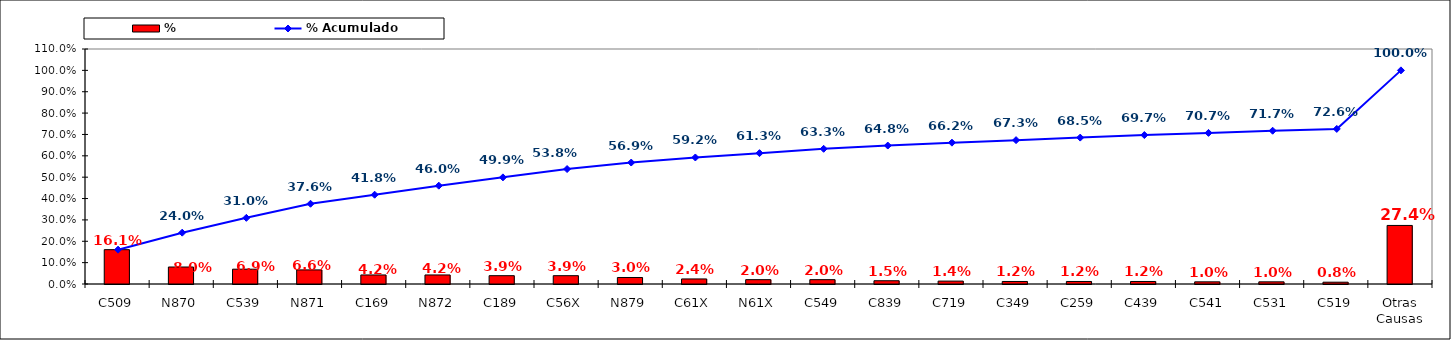
| Category | % |
|---|---|
| C509 | 0.161 |
| N870 | 0.08 |
| C539 | 0.069 |
| N871 | 0.066 |
| C169 | 0.042 |
| N872 | 0.042 |
| C189 | 0.039 |
| C56X | 0.039 |
| N879 | 0.03 |
| C61X | 0.024 |
| N61X | 0.02 |
| C549 | 0.02 |
| C839 | 0.015 |
| C719 | 0.014 |
| C349 | 0.012 |
| C259 | 0.012 |
| C439 | 0.012 |
| C541 | 0.01 |
| C531 | 0.01 |
| C519 | 0.008 |
| Otras Causas | 0.274 |